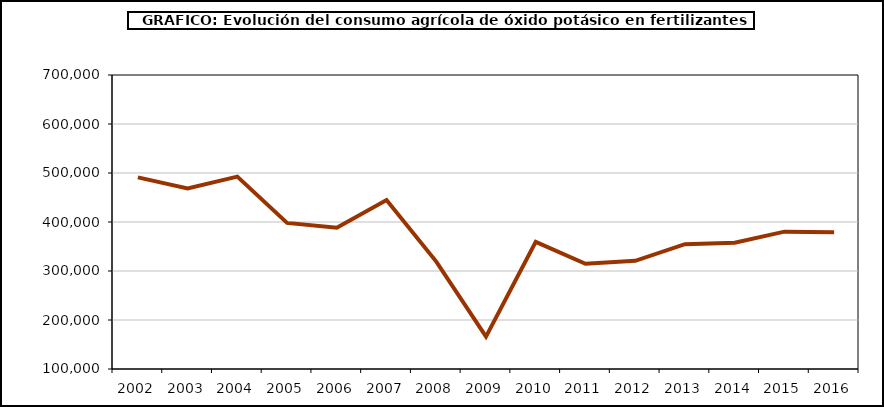
| Category | fertilizantes |
|---|---|
| 2002.0 | 491138 |
| 2003.0 | 468511 |
| 2004.0 | 492571 |
| 2005.0 | 398230 |
| 2006.0 | 388187 |
| 2007.0 | 444853 |
| 2008.0 | 319194 |
| 2009.0 | 166016 |
| 2010.0 | 359583 |
| 2011.0 | 314642 |
| 2012.0 | 320841 |
| 2013.0 | 354738 |
| 2014.0 | 357875 |
| 2015.0 | 380303 |
| 2016.0 | 379007 |